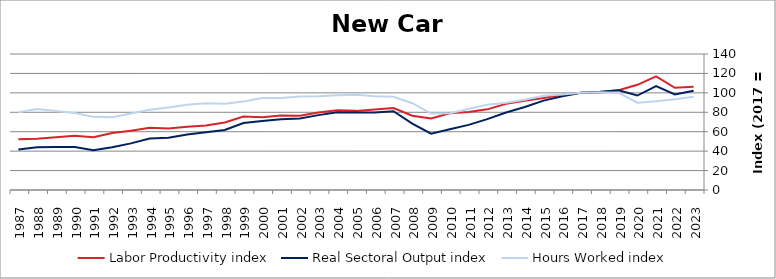
| Category | Labor Productivity index | Real Sectoral Output index | Hours Worked index |
|---|---|---|---|
| 2023.0 | 106.281 | 102.08 | 96.047 |
| 2022.0 | 105.21 | 98.309 | 93.441 |
| 2021.0 | 117.058 | 106.904 | 91.326 |
| 2020.0 | 108.261 | 97.248 | 89.827 |
| 2019.0 | 102.654 | 102.644 | 99.991 |
| 2018.0 | 100.477 | 101.029 | 100.549 |
| 2017.0 | 100 | 100 | 100 |
| 2016.0 | 98.044 | 96.431 | 98.355 |
| 2015.0 | 94.758 | 92.006 | 97.096 |
| 2014.0 | 91.974 | 85.47 | 92.929 |
| 2013.0 | 88.822 | 79.756 | 89.792 |
| 2012.0 | 83.038 | 72.972 | 87.878 |
| 2011.0 | 80.39 | 67.042 | 83.396 |
| 2010.0 | 78.926 | 62.455 | 79.131 |
| 2009.0 | 73.704 | 58.026 | 78.729 |
| 2008.0 | 76.443 | 68.305 | 89.355 |
| 2007.0 | 84.414 | 81.028 | 95.989 |
| 2006.0 | 82.853 | 79.902 | 96.438 |
| 2005.0 | 81.453 | 79.849 | 98.03 |
| 2004.0 | 82.081 | 80.082 | 97.565 |
| 2003.0 | 79.805 | 77.082 | 96.588 |
| 2002.0 | 76.537 | 73.686 | 96.276 |
| 2001.0 | 76.778 | 72.756 | 94.762 |
| 2000.0 | 74.938 | 70.996 | 94.74 |
| 1999.0 | 75.609 | 68.911 | 91.141 |
| 1998.0 | 69.505 | 61.761 | 88.859 |
| 1997.0 | 66.479 | 59.332 | 89.249 |
| 1996.0 | 65.179 | 57.182 | 87.731 |
| 1995.0 | 63.391 | 53.819 | 84.901 |
| 1994.0 | 64.102 | 52.925 | 82.564 |
| 1993.0 | 61.012 | 47.99 | 78.657 |
| 1992.0 | 58.755 | 43.999 | 74.885 |
| 1991.0 | 54.371 | 40.933 | 75.286 |
| 1990.0 | 55.886 | 44.259 | 79.196 |
| 1989.0 | 54.378 | 44.195 | 81.274 |
| 1988.0 | 52.838 | 44.04 | 83.35 |
| 1987.0 | 52.211 | 41.756 | 79.975 |